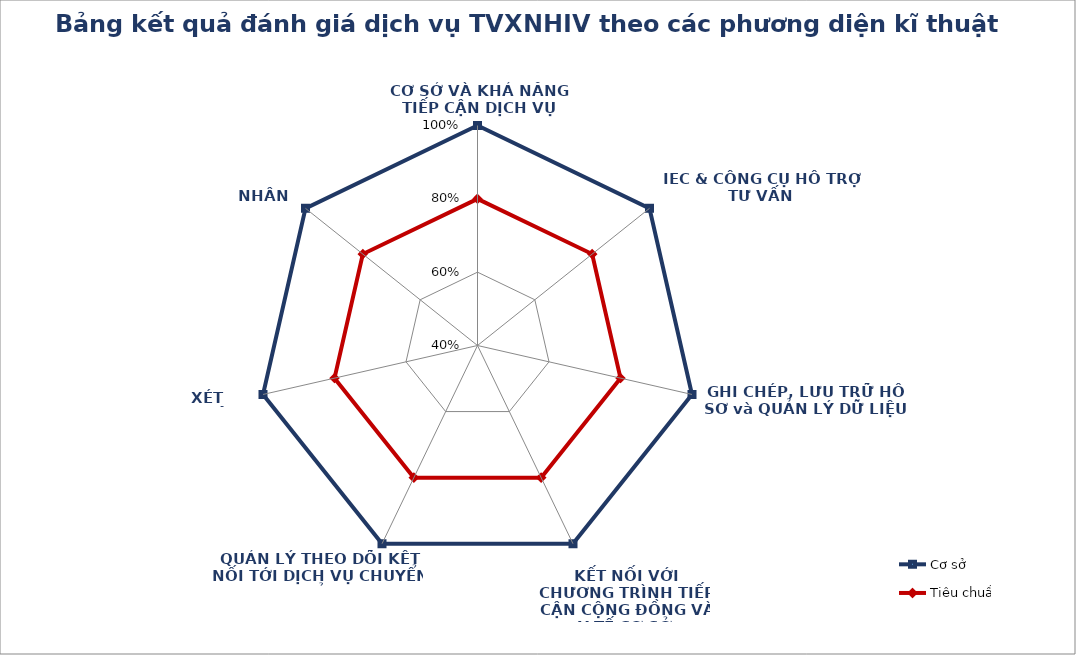
| Category | Cơ sở | Tiêu chuẩn |
|---|---|---|
| CƠ SỞ VÀ KHẢ NĂNG TIẾP CẬN DỊCH VỤ | 1 |  |
| IEC & CÔNG CỤ HỖ TRỢ TƯ VẤN | 1 |  |
| GHI CHÉP, LƯU TRỮ HỒ SƠ và QUẢN LÝ DỮ LIỆU | 1 |  |
| 
KẾT NỐI VỚI CHƯƠNG TRÌNH TIẾP CẬN CỘNG ĐỒNG VÀ Y TẾ CƠ SỞ | 1 |  |
| QUẢN LÝ THEO DÕI KẾT NỐI TỚI DỊCH VỤ CHUYỂN GỬI | 1 |  |
| XÉT NGHIỆM | 1 |  |
| NHÂN SỰ | 1 |  |